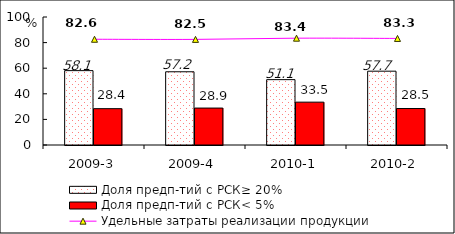
| Category | Доля предп-тий с РСК≥ 20% | Доля предп-тий с РСК< 5% |
|---|---|---|
| 2009-3 | 58.093 | 28.387 |
| 2009-4 | 57.213 | 28.853 |
| 2010-1 | 51.061 | 33.475 |
| 2010-2 | 57.668 | 28.494 |